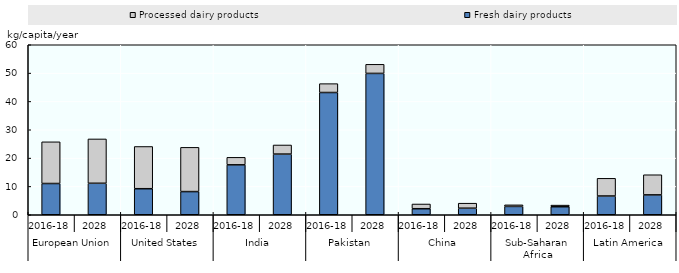
| Category | Fresh dairy products | Processed dairy products |
|---|---|---|
| 0 | 11.027 | 14.718 |
| 1 | 11.108 | 15.653 |
| 2 | 9.189 | 14.907 |
| 3 | 8.173 | 15.619 |
| 4 | 17.615 | 2.654 |
| 5 | 21.411 | 3.214 |
| 6 | 43.142 | 3.134 |
| 7 | 49.883 | 3.213 |
| 8 | 2.124 | 1.674 |
| 9 | 2.314 | 1.77 |
| 10 | 2.941 | 0.56 |
| 11 | 2.834 | 0.573 |
| 12 | 6.616 | 6.249 |
| 13 | 7.012 | 7.11 |